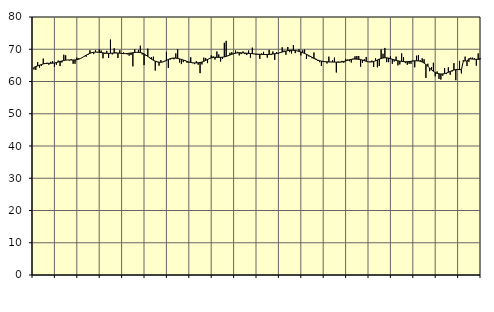
| Category | Piggar | Series 1 |
|---|---|---|
| nan | 63.7 | 64.4 |
| 1.0 | 63.6 | 64.64 |
| 1.0 | 66 | 64.83 |
| 1.0 | 64.3 | 65.06 |
| 1.0 | 64.8 | 65.27 |
| 1.0 | 67.1 | 65.45 |
| 1.0 | 65.7 | 65.58 |
| 1.0 | 65.8 | 65.63 |
| 1.0 | 65.2 | 65.65 |
| 1.0 | 66.1 | 65.65 |
| 1.0 | 66.3 | 65.68 |
| 1.0 | 64.5 | 65.75 |
| nan | 65.2 | 65.87 |
| 2.0 | 66.5 | 66.03 |
| 2.0 | 64.8 | 66.21 |
| 2.0 | 65.9 | 66.38 |
| 2.0 | 68.3 | 66.52 |
| 2.0 | 68.1 | 66.62 |
| 2.0 | 66.7 | 66.67 |
| 2.0 | 66.5 | 66.68 |
| 2.0 | 66.9 | 66.67 |
| 2.0 | 65.5 | 66.66 |
| 2.0 | 65.5 | 66.68 |
| 2.0 | 67.4 | 66.76 |
| nan | 67.2 | 66.92 |
| 3.0 | 67.1 | 67.16 |
| 3.0 | 67.6 | 67.46 |
| 3.0 | 67.7 | 67.82 |
| 3.0 | 67.7 | 68.17 |
| 3.0 | 68.3 | 68.49 |
| 3.0 | 69.7 | 68.75 |
| 3.0 | 69.1 | 68.95 |
| 3.0 | 68.5 | 69.07 |
| 3.0 | 69.7 | 69.11 |
| 3.0 | 69 | 69.11 |
| 3.0 | 69.9 | 69.06 |
| nan | 69.6 | 68.97 |
| 4.0 | 67.2 | 68.88 |
| 4.0 | 68.6 | 68.81 |
| 4.0 | 69.5 | 68.75 |
| 4.0 | 67.3 | 68.74 |
| 4.0 | 73 | 68.75 |
| 4.0 | 68.4 | 68.79 |
| 4.0 | 70.3 | 68.82 |
| 4.0 | 69 | 68.84 |
| 4.0 | 67.3 | 68.82 |
| 4.0 | 69.7 | 68.77 |
| 4.0 | 68.7 | 68.7 |
| nan | 69 | 68.65 |
| 5.0 | 68.7 | 68.65 |
| 5.0 | 68.4 | 68.69 |
| 5.0 | 68 | 68.76 |
| 5.0 | 68.2 | 68.84 |
| 5.0 | 64.7 | 68.92 |
| 5.0 | 70 | 69 |
| 5.0 | 69.1 | 69.05 |
| 5.0 | 69.8 | 69.05 |
| 5.0 | 71.1 | 68.98 |
| 5.0 | 68.4 | 68.82 |
| 5.0 | 65.1 | 68.56 |
| nan | 68 | 68.19 |
| 6.0 | 70.2 | 67.77 |
| 6.0 | 67.6 | 67.33 |
| 6.0 | 67.5 | 66.92 |
| 6.0 | 67.7 | 66.57 |
| 6.0 | 63.4 | 66.3 |
| 6.0 | 66 | 66.1 |
| 6.0 | 64.9 | 65.98 |
| 6.0 | 66.6 | 65.97 |
| 6.0 | 66 | 66.07 |
| 6.0 | 66.4 | 66.27 |
| 6.0 | 69.2 | 66.54 |
| nan | 64.2 | 66.83 |
| 7.0 | 66.8 | 67.07 |
| 7.0 | 67.1 | 67.22 |
| 7.0 | 66.9 | 67.28 |
| 7.0 | 68.7 | 67.25 |
| 7.0 | 70 | 67.15 |
| 7.0 | 65.9 | 67.01 |
| 7.0 | 65.4 | 66.85 |
| 7.0 | 66 | 66.66 |
| 7.0 | 66.6 | 66.45 |
| 7.0 | 65.8 | 66.24 |
| 7.0 | 65.9 | 66.05 |
| nan | 67.5 | 65.9 |
| 8.0 | 65.7 | 65.8 |
| 8.0 | 65.4 | 65.76 |
| 8.0 | 66.3 | 65.77 |
| 8.0 | 65.2 | 65.81 |
| 8.0 | 62.6 | 65.89 |
| 8.0 | 65.3 | 66.04 |
| 8.0 | 67.4 | 66.26 |
| 8.0 | 67.3 | 66.54 |
| 8.0 | 65.7 | 66.84 |
| 8.0 | 67 | 67.11 |
| 8.0 | 68.1 | 67.32 |
| nan | 67.8 | 67.45 |
| 9.0 | 66.8 | 67.51 |
| 9.0 | 69.3 | 67.51 |
| 9.0 | 68.4 | 67.49 |
| 9.0 | 66.2 | 67.49 |
| 9.0 | 67 | 67.53 |
| 9.0 | 72 | 67.63 |
| 9.0 | 72.6 | 67.79 |
| 9.0 | 68.1 | 67.98 |
| 9.0 | 68.9 | 68.21 |
| 9.0 | 69.1 | 68.43 |
| 9.0 | 68.5 | 68.63 |
| nan | 69.6 | 68.78 |
| 10.0 | 69.2 | 68.88 |
| 10.0 | 68.1 | 68.92 |
| 10.0 | 68.5 | 68.91 |
| 10.0 | 69.3 | 68.87 |
| 10.0 | 68.5 | 68.82 |
| 10.0 | 68.2 | 68.77 |
| 10.0 | 69.6 | 68.72 |
| 10.0 | 67.4 | 68.67 |
| 10.0 | 70.5 | 68.62 |
| 10.0 | 68.5 | 68.56 |
| 10.0 | 68.3 | 68.52 |
| nan | 68.3 | 68.47 |
| 11.0 | 67 | 68.44 |
| 11.0 | 68.7 | 68.41 |
| 11.0 | 69.2 | 68.39 |
| 11.0 | 68.5 | 68.38 |
| 11.0 | 67.4 | 68.38 |
| 11.0 | 69.8 | 68.41 |
| 11.0 | 68.2 | 68.46 |
| 11.0 | 69.3 | 68.52 |
| 11.0 | 66.7 | 68.6 |
| 11.0 | 69.1 | 68.7 |
| 11.0 | 68.6 | 68.82 |
| nan | 69.1 | 68.97 |
| 12.0 | 70.6 | 69.13 |
| 12.0 | 69.6 | 69.29 |
| 12.0 | 68.3 | 69.44 |
| 12.0 | 70.7 | 69.56 |
| 12.0 | 69.1 | 69.65 |
| 12.0 | 68.7 | 69.69 |
| 12.0 | 71.3 | 69.68 |
| 12.0 | 68.8 | 69.6 |
| 12.0 | 69.5 | 69.48 |
| 12.0 | 70 | 69.32 |
| 12.0 | 68.1 | 69.14 |
| nan | 69.7 | 68.93 |
| 13.0 | 69.9 | 68.7 |
| 13.0 | 67 | 68.43 |
| 13.0 | 67.8 | 68.14 |
| 13.0 | 67.6 | 67.82 |
| 13.0 | 67.2 | 67.49 |
| 13.0 | 69 | 67.17 |
| 13.0 | 67.1 | 66.88 |
| 13.0 | 66.4 | 66.64 |
| 13.0 | 66 | 66.45 |
| 13.0 | 64.8 | 66.32 |
| 13.0 | 66.3 | 66.22 |
| nan | 66.1 | 66.15 |
| 14.0 | 65.6 | 66.1 |
| 14.0 | 67.7 | 66.06 |
| 14.0 | 66.1 | 66.04 |
| 14.0 | 66.6 | 66.03 |
| 14.0 | 67.4 | 66.02 |
| 14.0 | 62.8 | 66 |
| 14.0 | 66.2 | 65.97 |
| 14.0 | 66.1 | 65.99 |
| 14.0 | 66.4 | 66.06 |
| 14.0 | 65.8 | 66.2 |
| 14.0 | 67 | 66.38 |
| nan | 66.8 | 66.56 |
| 15.0 | 66.3 | 66.73 |
| 15.0 | 65.9 | 66.86 |
| 15.0 | 67.1 | 66.94 |
| 15.0 | 67.8 | 66.96 |
| 15.0 | 67.9 | 66.93 |
| 15.0 | 67.9 | 66.88 |
| 15.0 | 64.6 | 66.79 |
| 15.0 | 65.8 | 66.65 |
| 15.0 | 66.9 | 66.46 |
| 15.0 | 67.6 | 66.26 |
| 15.0 | 66.1 | 66.11 |
| nan | 66.2 | 66.04 |
| 16.0 | 66.5 | 66.07 |
| 16.0 | 64.5 | 66.21 |
| 16.0 | 67.2 | 66.42 |
| 16.0 | 64.4 | 66.67 |
| 16.0 | 64.8 | 66.93 |
| 16.0 | 69.9 | 67.15 |
| 16.0 | 68.6 | 67.29 |
| 16.0 | 70.4 | 67.36 |
| 16.0 | 66 | 67.34 |
| 16.0 | 66 | 67.24 |
| 16.0 | 67.8 | 67.09 |
| nan | 65.5 | 66.9 |
| 17.0 | 66.2 | 66.71 |
| 17.0 | 67.7 | 66.55 |
| 17.0 | 65 | 66.41 |
| 17.0 | 65.3 | 66.3 |
| 17.0 | 68.7 | 66.23 |
| 17.0 | 67.6 | 66.17 |
| 17.0 | 65.7 | 66.13 |
| 17.0 | 65.2 | 66.14 |
| 17.0 | 65.5 | 66.18 |
| 17.0 | 65.5 | 66.27 |
| 17.0 | 66.5 | 66.35 |
| nan | 64.4 | 66.41 |
| 18.0 | 68 | 66.42 |
| 18.0 | 68.2 | 66.38 |
| 18.0 | 66.6 | 66.26 |
| 18.0 | 67.2 | 66.05 |
| 18.0 | 66.9 | 65.72 |
| 18.0 | 61.1 | 65.27 |
| 18.0 | 65.5 | 64.73 |
| 18.0 | 63.2 | 64.17 |
| 18.0 | 64.5 | 63.63 |
| 18.0 | 65.8 | 63.15 |
| 18.0 | 61.6 | 62.77 |
| nan | 63.1 | 62.52 |
| 19.0 | 60.8 | 62.38 |
| 19.0 | 60.6 | 62.32 |
| 19.0 | 61.8 | 62.35 |
| 19.0 | 64.2 | 62.45 |
| 19.0 | 62.3 | 62.62 |
| 19.0 | 64.4 | 62.85 |
| 19.0 | 62.1 | 63.12 |
| 19.0 | 63.1 | 63.37 |
| 19.0 | 65.7 | 63.56 |
| 19.0 | 60.4 | 63.68 |
| 19.0 | 63.8 | 63.72 |
| nan | 66.4 | 63.71 |
| 20.0 | 62.5 | 63.65 |
| 20.0 | 66.6 | 66.26 |
| 20.0 | 67.7 | 66.42 |
| 20.0 | 64.8 | 66.32 |
| 20.0 | 66.1 | 67.08 |
| 20.0 | 67.4 | 67 |
| 20.0 | 67.4 | 66.94 |
| 20.0 | 67.2 | 66.9 |
| 20.0 | 64.9 | 66.89 |
| 20.0 | 68.7 | 66.88 |
| 20.0 | 67.3 | 66.88 |